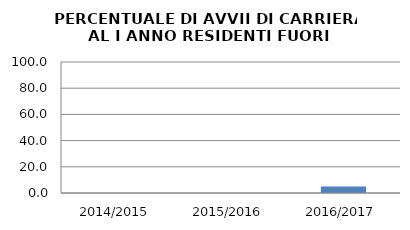
| Category | 2014/2015 2015/2016 2016/2017 |
|---|---|
| 2014/2015 | 0 |
| 2015/2016 | 0 |
| 2016/2017 | 5 |